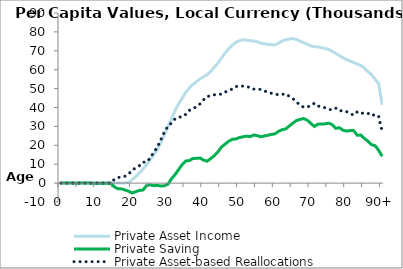
| Category | Private Asset Income | Private Saving | Private Asset-based Reallocations |
|---|---|---|---|
| 0 | 0 | -0.073 | 0.073 |
|  | 0 | -0.039 | 0.039 |
| 2 | 0 | -0.463 | 0.463 |
| 3 | 0 | -7.569 | 7.569 |
| 4 | 0 | -13.278 | 13.278 |
| 5 | 0 | -14.368 | 14.368 |
| 6 | 0 | -11.482 | 11.482 |
| 7 | 0 | -11.727 | 11.727 |
| 8 | 0 | -11.931 | 11.931 |
| 9 | 0 | -15.501 | 15.501 |
| 10 | 0 | -17.895 | 17.895 |
| 11 | 0 | -18.283 | 18.283 |
| 12 | 0 | -22.149 | 22.149 |
| 13 | 0 | -25.476 | 25.476 |
| 14 | 0 | -28.892 | 28.892 |
| 15 | 0 | -1997.039 | 1997.039 |
| 16 | 0 | -2997.441 | 2997.441 |
| 17 | 0 | -3072.7 | 3072.7 |
| 18 | 0 | -3694.673 | 3694.673 |
| 19 | 459.443 | -4330.025 | 4789.468 |
| 20 | 1747.202 | -5240.786 | 6987.988 |
| 21 | 3487.446 | -4524.808 | 8012.254 |
| 22 | 5338.656 | -3893.048 | 9231.704 |
| 23 | 7401.513 | -3678.697 | 11080.21 |
| 24 | 9784.217 | -1358.795 | 11143.012 |
| 25 | 12285.355 | -866.011 | 13151.366 |
| 26 | 14869.424 | -1363.87 | 16233.295 |
| 27 | 17729.501 | -1185.868 | 18915.369 |
| 28 | 21375.669 | -1509.093 | 22884.762 |
| 29 | 25539.57 | -1446.321 | 26985.891 |
| 30 | 29598.326 | -574.796 | 30173.122 |
| 31 | 34097.317 | 2311.378 | 31785.939 |
| 32 | 38457.814 | 4426.013 | 34031.801 |
| 33 | 42083.454 | 7197.627 | 34885.827 |
| 34 | 44906.296 | 9851.798 | 35054.498 |
| 35 | 48097.172 | 11712.116 | 36385.056 |
| 36 | 50401.824 | 11898.107 | 38503.718 |
| 37 | 52239.333 | 13051.214 | 39188.119 |
| 38 | 53675.694 | 13092.932 | 40582.762 |
| 39 | 55172.6 | 13264.742 | 41907.858 |
| 40 | 56221.685 | 12115.089 | 44106.597 |
| 41 | 57448.436 | 11604.232 | 45844.204 |
| 42 | 59155.206 | 13005.101 | 46150.105 |
| 43 | 61306.142 | 14583.455 | 46722.687 |
| 44 | 63530.246 | 16498.555 | 47031.69 |
| 45 | 66140.215 | 19099.535 | 47040.68 |
| 46 | 68790.61 | 20638.508 | 48152.103 |
| 47 | 71081.508 | 22104.006 | 48977.501 |
| 48 | 72945.9 | 23135.816 | 49810.084 |
| 49 | 74482.255 | 23365.359 | 51116.896 |
| 50 | 75338.351 | 24067.781 | 51270.569 |
| 51 | 75825.944 | 24507.095 | 51318.849 |
| 52 | 75591.026 | 24846.169 | 50744.857 |
| 53 | 75428.848 | 24575.108 | 50853.74 |
| 54 | 75176.563 | 25437.48 | 49739.084 |
| 55 | 74811.94 | 25137.198 | 49674.742 |
| 56 | 74041.88 | 24479.885 | 49561.994 |
| 57 | 73703.225 | 24929.468 | 48773.757 |
| 58 | 73387.193 | 25340.239 | 48046.954 |
| 59 | 73275.503 | 25752.724 | 47522.779 |
| 60 | 73197.636 | 26062.886 | 47134.749 |
| 61 | 74110.299 | 27419.29 | 46691.008 |
| 62 | 75201.052 | 28258.868 | 46942.184 |
| 63 | 75880.477 | 28690.472 | 47190.005 |
| 64 | 76170.963 | 30249.176 | 45921.787 |
| 65 | 76488.495 | 31757.823 | 44730.673 |
| 66 | 75981.556 | 33125.653 | 42855.903 |
| 67 | 75097.404 | 33719.021 | 41378.383 |
| 68 | 74255.466 | 34145.626 | 40109.841 |
| 69 | 73535.351 | 33311.58 | 40223.771 |
| 70 | 72644.881 | 31609.242 | 41035.639 |
| 71 | 72239.178 | 29988.65 | 42250.528 |
| 72 | 71970.014 | 31196.136 | 40773.878 |
| 73 | 71669.134 | 31213.998 | 40455.136 |
| 74 | 71211.128 | 31359.098 | 39852.03 |
| 75 | 70746.224 | 31740.107 | 39006.118 |
| 76 | 69713.972 | 30943.238 | 38770.734 |
| 77 | 68615.843 | 28957.059 | 39658.784 |
| 78 | 67505.523 | 29327.453 | 38178.07 |
| 79 | 66352.189 | 27990.773 | 38361.416 |
| 80 | 65361.352 | 27531.553 | 37829.799 |
| 81 | 64602.993 | 27788.458 | 36814.535 |
| 82 | 63805.938 | 27832.475 | 35973.463 |
| 83 | 63022.207 | 25330.338 | 37691.869 |
| 84 | 62207.171 | 25420.496 | 36786.675 |
| 85 | 60852.144 | 23613.378 | 37238.766 |
| 86 | 58977.115 | 22209.525 | 36767.589 |
| 87 | 57379.831 | 20336.753 | 37043.078 |
| 88 | 54977.801 | 19787.198 | 35190.603 |
| 89 | 52633.361 | 17353.381 | 35279.98 |
| 90+ | 41308.47 | 14147.391 | 27161.079 |